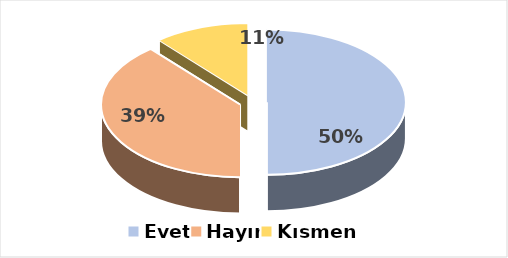
| Category | Evet |
|---|---|
| Evet | 0.5 |
| Hayır | 0.389 |
| Kısmen | 0.111 |